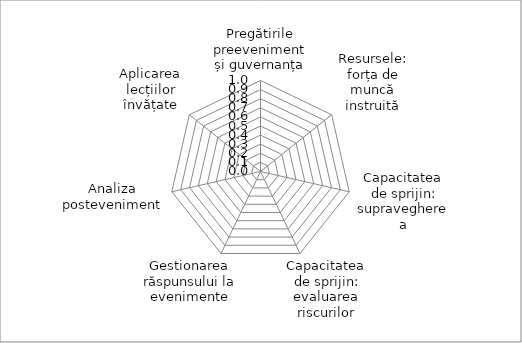
| Category | Series 0 |
|---|---|
| Pregătirile preeveniment și guvernanța | 0 |
| Resursele: forța de muncă instruită | 0 |
| Capacitatea de sprijin: supravegherea | 0 |
| Capacitatea de sprijin: evaluarea riscurilor | 0 |
| Gestionarea răspunsului la evenimente | 0 |
| Analiza posteveniment | 0 |
| Aplicarea lecțiilor învățate | 0 |